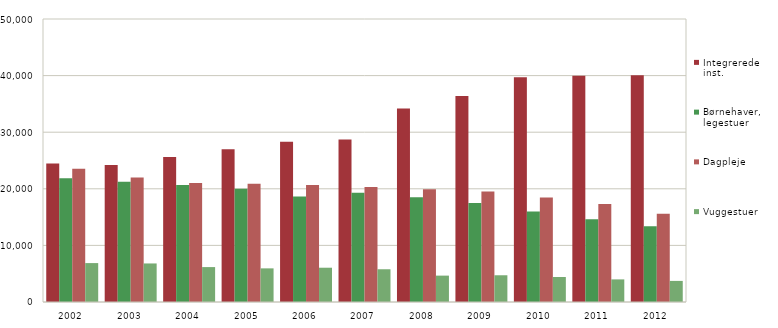
| Category | Integrerede inst. | Børnehaver, legestuer   | Dagpleje | Vuggestuer  |
|---|---|---|---|---|
| 2002.0 | 24492 | 21871 | 23530 | 6875 |
| 2003.0 | 24186 | 21246 | 22006 | 6811 |
| 2004.0 | 25638 | 20663 | 21018 | 6169 |
| 2005.0 | 26984 | 19994 | 20885 | 5943 |
| 2006.0 | 28300 | 18618 | 20652 | 6057 |
| 2007.0 | 28692 | 19290 | 20308 | 5784 |
| 2008.0 | 34207 | 18526 | 19934 | 4661 |
| 2009.0 | 36403 | 17491 | 19534 | 4724 |
| 2010.0 | 39708 | 15986 | 18458 | 4415 |
| 2011.0 | 39980 | 14605 | 17310 | 3994 |
| 2012.0 | 40049 | 13376 | 15587 | 3727 |